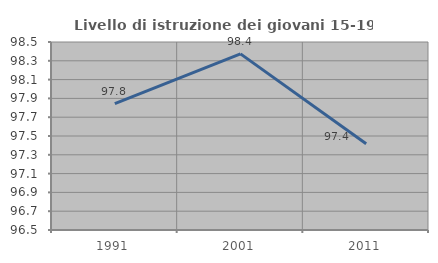
| Category | Livello di istruzione dei giovani 15-19 anni |
|---|---|
| 1991.0 | 97.844 |
| 2001.0 | 98.374 |
| 2011.0 | 97.417 |